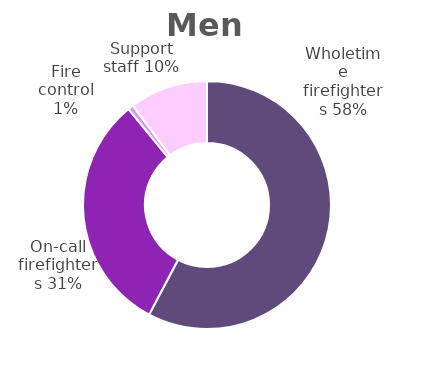
| Category | Men |
|---|---|
| Wholetime firefighters | 0.577 |
| On-call firefighters | 0.314 |
| Fire control | 0.007 |
| Support staff | 0.102 |